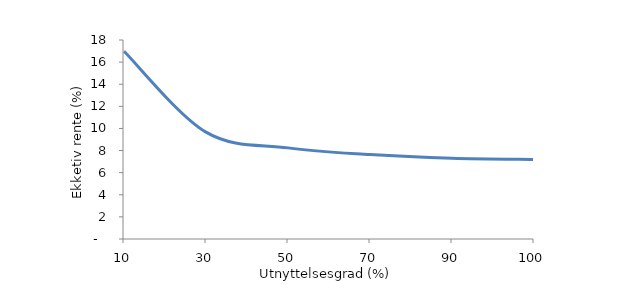
| Category | Series 0 |
|---|---|
| 10.0 | 16.986 |
| 30.0 | 9.665 |
| 50.0 | 8.243 |
| 70.0 | 7.638 |
| 90.0 | 7.303 |
| 100.0 | 7.186 |